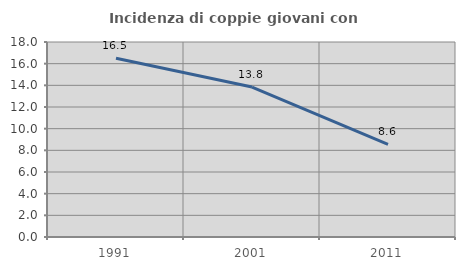
| Category | Incidenza di coppie giovani con figli |
|---|---|
| 1991.0 | 16.505 |
| 2001.0 | 13.841 |
| 2011.0 | 8.559 |